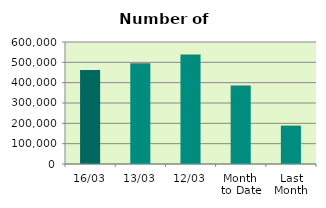
| Category | Series 0 |
|---|---|
| 16/03 | 461836 |
| 13/03 | 495640 |
| 12/03 | 538716 |
| Month 
to Date | 386490.909 |
| Last
Month | 188783.7 |